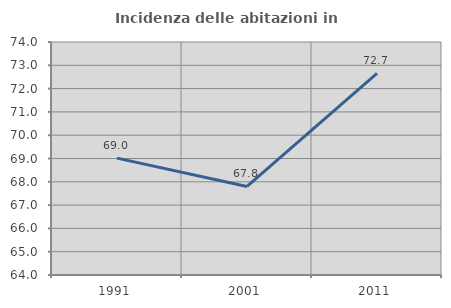
| Category | Incidenza delle abitazioni in proprietà  |
|---|---|
| 1991.0 | 69.017 |
| 2001.0 | 67.802 |
| 2011.0 | 72.651 |